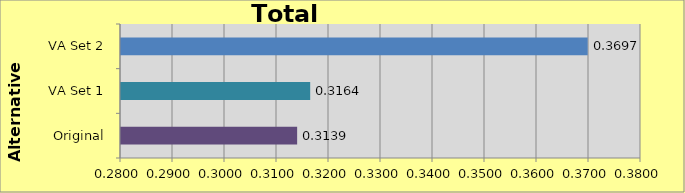
| Category | Original VA Set 1 VA Set 2 |
|---|---|
| Original | 0.314 |
| VA Set 1 | 0.316 |
| VA Set 2 | 0.37 |